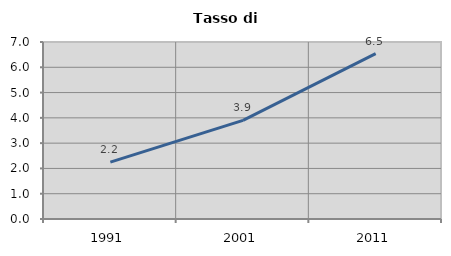
| Category | Tasso di disoccupazione   |
|---|---|
| 1991.0 | 2.247 |
| 2001.0 | 3.902 |
| 2011.0 | 6.542 |